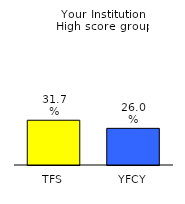
| Category | Series 0 |
|---|---|
| TFS | 0.317 |
| YFCY | 0.26 |